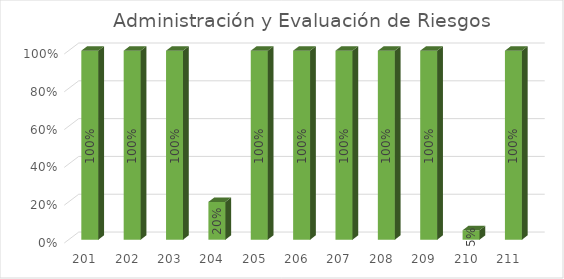
| Category | % Avance |
|---|---|
| 201.0 | 1 |
| 202.0 | 1 |
| 203.0 | 1 |
| 204.0 | 0.2 |
| 205.0 | 1 |
| 206.0 | 1 |
| 207.0 | 1 |
| 208.0 | 1 |
| 209.0 | 1 |
| 210.0 | 0.05 |
| 211.0 | 1 |